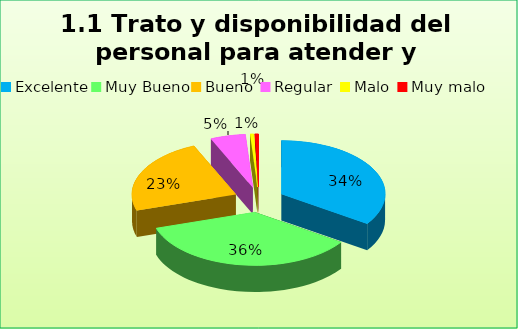
| Category | Series 0 |
|---|---|
| Excelente | 0.345 |
| Muy Bueno | 0.356 |
| Bueno  | 0.233 |
| Regular  | 0.055 |
| Malo  | 0.006 |
| Muy malo  | 0.006 |